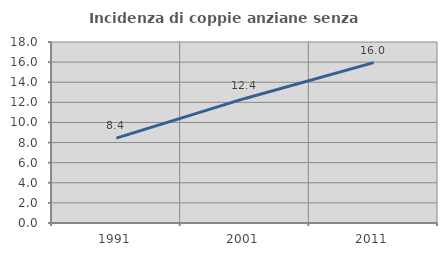
| Category | Incidenza di coppie anziane senza figli  |
|---|---|
| 1991.0 | 8.443 |
| 2001.0 | 12.387 |
| 2011.0 | 15.952 |